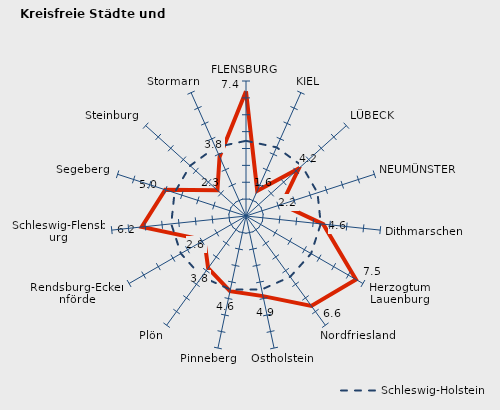
| Category | Kreise | Schleswig-Holstein |
|---|---|---|
| FLENSBURG | 7.394 | 4.455 |
| KIEL | 1.638 | 4.455 |
| LÜBECK | 4.216 | 4.455 |
| NEUMÜNSTER | 2.215 | 4.455 |
| Dithmarschen | 4.6 | 4.455 |
| Herzogtum Lauenburg | 7.527 | 4.455 |
| Nordfriesland | 6.587 | 4.455 |
| Ostholstein | 4.854 | 4.455 |
| Pinneberg | 4.557 | 4.455 |
| Plön | 3.819 | 4.455 |
| Rendsburg-Eckernförde | 2.85 | 4.455 |
| Schleswig-Flensburg | 6.213 | 4.455 |
| Segeberg | 5.029 | 4.455 |
| Steinburg | 2.28 | 4.455 |
| Stormarn | 3.849 | 4.455 |